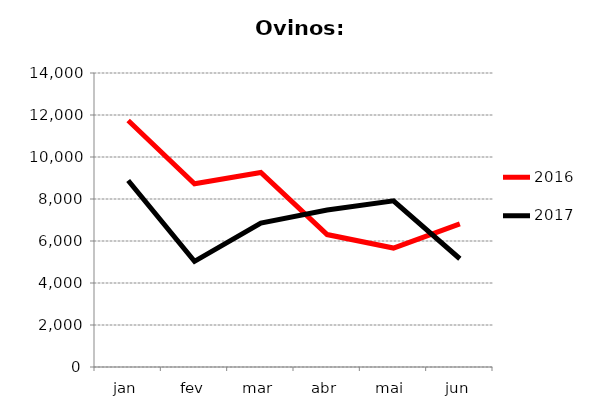
| Category | 2016 | 2017 |
|---|---|---|
| jan | 11741 | 8882 |
| fev | 8726 | 5031 |
| mar | 9264 | 6855 |
| abr | 6306 | 7472 |
| mai | 5665 | 7915 |
| jun | 6819 | 5155 |